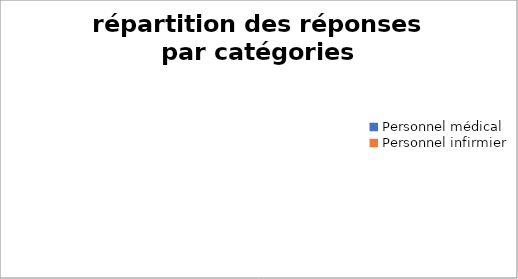
| Category | Series 0 |
|---|---|
| Personnel médical | 0 |
| Personnel infirmier | 0 |